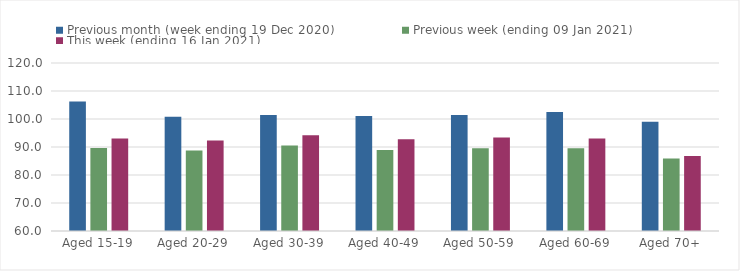
| Category | Previous month (week ending 19 Dec 2020) | Previous week (ending 09 Jan 2021) | This week (ending 16 Jan 2021) |
|---|---|---|---|
| Aged 15-19 | 106.22 | 89.67 | 93.01 |
| Aged 20-29 | 100.76 | 88.75 | 92.32 |
| Aged 30-39 | 101.46 | 90.51 | 94.16 |
| Aged 40-49 | 101.05 | 88.9 | 92.8 |
| Aged 50-59 | 101.46 | 89.56 | 93.42 |
| Aged 60-69 | 102.52 | 89.55 | 93.05 |
| Aged 70+ | 98.98 | 85.93 | 86.75 |